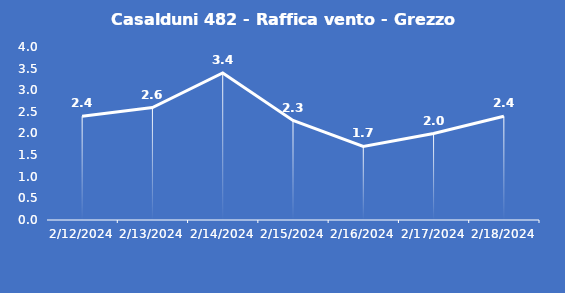
| Category | Casalduni 482 - Raffica vento - Grezzo (m/s) |
|---|---|
| 2/12/24 | 2.4 |
| 2/13/24 | 2.6 |
| 2/14/24 | 3.4 |
| 2/15/24 | 2.3 |
| 2/16/24 | 1.7 |
| 2/17/24 | 2 |
| 2/18/24 | 2.4 |